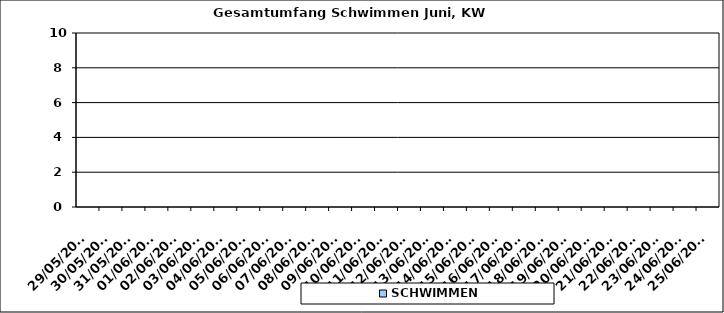
| Category | SCHWIMMEN |
|---|---|
| 29/05/2023 | 0 |
| 30/05/2023 | 0 |
| 31/05/2023 | 0 |
| 01/06/2023 | 0 |
| 02/06/2023 | 0 |
| 03/06/2023 | 0 |
| 04/06/2023 | 0 |
| 05/06/2023 | 0 |
| 06/06/2023 | 0 |
| 07/06/2023 | 0 |
| 08/06/2023 | 0 |
| 09/06/2023 | 0 |
| 10/06/2023 | 0 |
| 11/06/2023 | 0 |
| 12/06/2023 | 0 |
| 13/06/2023 | 0 |
| 14/06/2023 | 0 |
| 15/06/2023 | 0 |
| 16/06/2023 | 0 |
| 17/06/2023 | 0 |
| 18/06/2023 | 0 |
| 19/06/2023 | 0 |
| 20/06/2023 | 0 |
| 21/06/2023 | 0 |
| 22/06/2023 | 0 |
| 23/06/2023 | 0 |
| 24/06/2023 | 0 |
| 25/06/2023 | 0 |